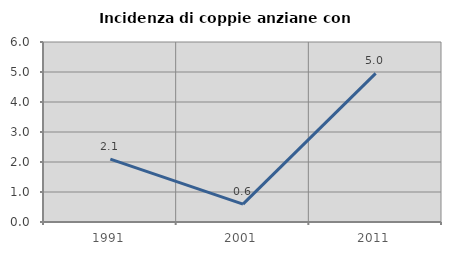
| Category | Incidenza di coppie anziane con figli |
|---|---|
| 1991.0 | 2.098 |
| 2001.0 | 0.595 |
| 2011.0 | 4.956 |